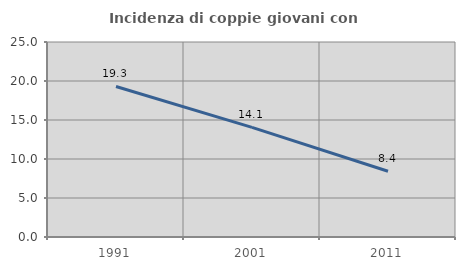
| Category | Incidenza di coppie giovani con figli |
|---|---|
| 1991.0 | 19.298 |
| 2001.0 | 14.052 |
| 2011.0 | 8.424 |